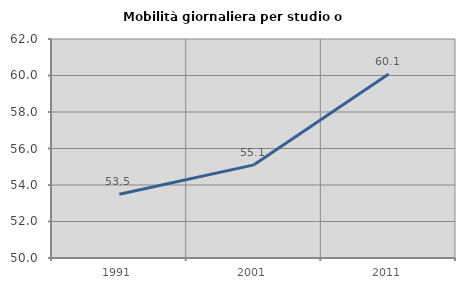
| Category | Mobilità giornaliera per studio o lavoro |
|---|---|
| 1991.0 | 53.491 |
| 2001.0 | 55.104 |
| 2011.0 | 60.082 |